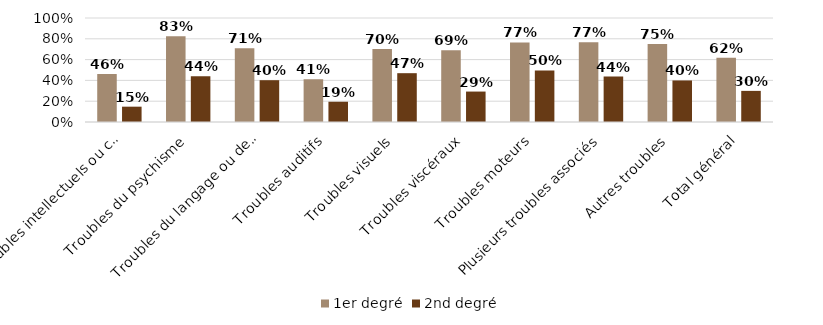
| Category | 1er degré | 2nd degré |
|---|---|---|
| Troubles intellectuels ou cognitifs | 0.461 | 0.147 |
| Troubles du psychisme | 0.826 | 0.441 |
| Troubles du langage ou de la parole | 0.708 | 0.402 |
| Troubles auditifs | 0.411 | 0.195 |
| Troubles visuels | 0.701 | 0.469 |
| Troubles viscéraux | 0.689 | 0.293 |
| Troubles moteurs | 0.765 | 0.495 |
| Plusieurs troubles associés | 0.767 | 0.437 |
| Autres troubles | 0.75 | 0.399 |
| Total général | 0.618 | 0.299 |